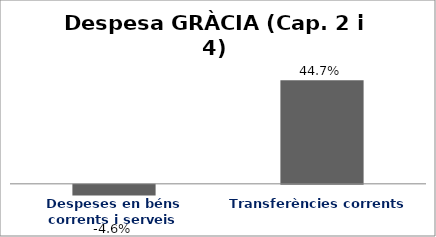
| Category | Series 0 |
|---|---|
| Despeses en béns corrents i serveis | -0.046 |
| Transferències corrents | 0.447 |